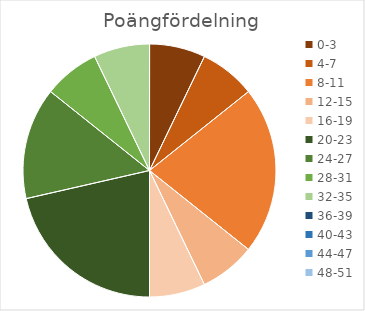
| Category | Series 0 |
|---|---|
| 0-3 | 1 |
| 4-7 | 1 |
| 8-11 | 3 |
| 12-15 | 1 |
| 16-19 | 1 |
| 20-23 | 3 |
| 24-27 | 2 |
| 28-31 | 1 |
| 32-35 | 1 |
| 36-39 | 0 |
| 40-43 | 0 |
| 44-47 | 0 |
| 48-51 | 0 |